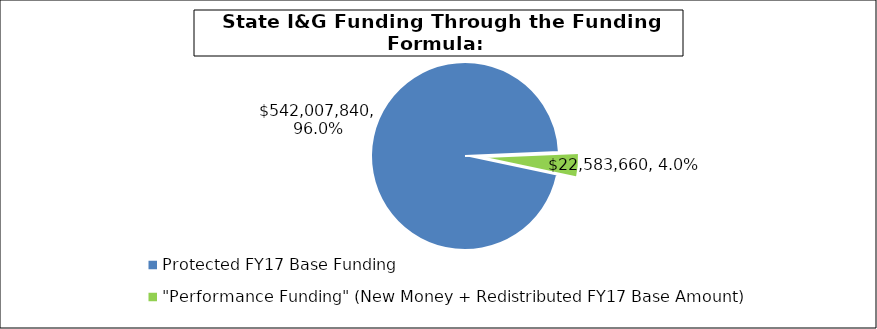
| Category | Series 0 |
|---|---|
| Protected FY17 Base Funding | 542007840 |
| "Performance Funding" (New Money + Redistributed FY17 Base Amount) | 22583660 |